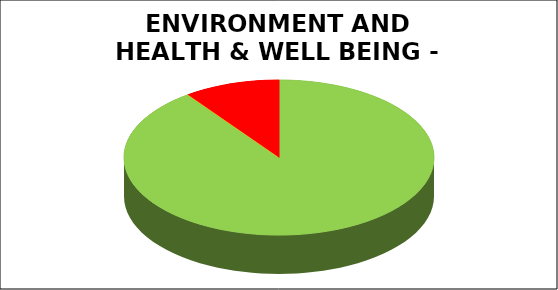
| Category | Series 0 |
|---|---|
| Green | 0.9 |
| Amber | 0 |
| Red | 0.1 |